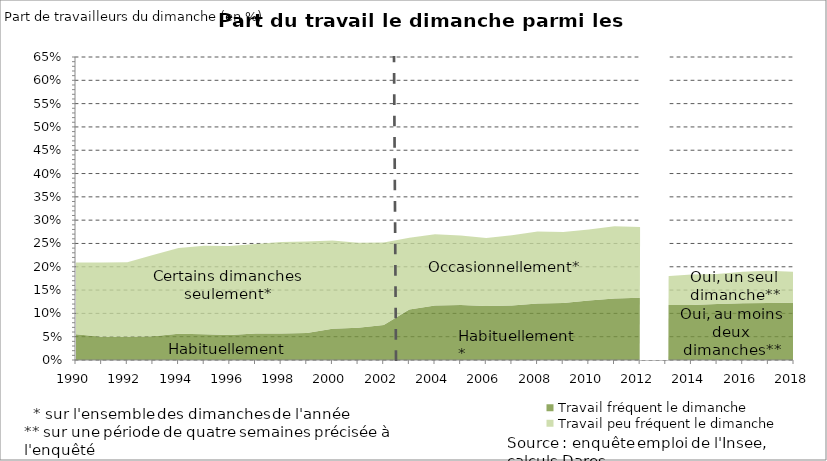
| Category | Travail fréquent le dimanche | Travail peu fréquent le dimanche |
|---|---|---|
| 1990.0 | 0.055 | 0.154 |
| 1991.0 | 0.05 | 0.16 |
| 1992.0 | 0.05 | 0.16 |
| 1993.0 | 0.051 | 0.174 |
| 1994.0 | 0.056 | 0.184 |
| 1995.0 | 0.055 | 0.19 |
| 1996.0 | 0.053 | 0.191 |
| 1997.0 | 0.057 | 0.192 |
| 1998.0 | 0.057 | 0.196 |
| 1999.0 | 0.058 | 0.196 |
| 2000.0 | 0.067 | 0.189 |
| 2001.0 | 0.069 | 0.183 |
| 2002.0 | 0.075 | 0.177 |
| 2003.0 | 0.108 | 0.154 |
| 2004.0 | 0.117 | 0.153 |
| 2005.0 | 0.118 | 0.149 |
| 2006.0 | 0.116 | 0.146 |
| 2007.0 | 0.117 | 0.151 |
| 2008.0 | 0.121 | 0.155 |
| 2009.0 | 0.122 | 0.152 |
| 2010.0 | 0.128 | 0.152 |
| 2011.0 | 0.132 | 0.155 |
| 2012.0 | 0.134 | 0.152 |
| 2013.0 | 0.118 | 0.062 |
| 2014.0 | 0.118 | 0.065 |
| 2015.0 | 0.12 | 0.065 |
| 2016.0 | 0.122 | 0.067 |
| 2017.0 | 0.123 | 0.069 |
| 2018.0 | 0.123 | 0.066 |